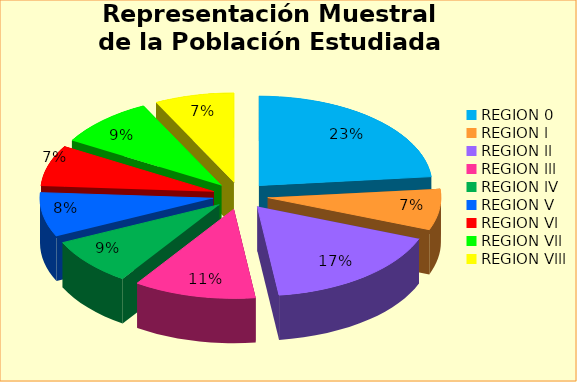
| Category | Series 0 | Series 1 |
|---|---|---|
| REGION 0 | 41 | 0.234 |
| REGION l | 13 | 0.074 |
| REGION ll | 30 | 0.171 |
| REGION lll | 20 | 0.114 |
| REGION lV | 15 | 0.086 |
| REGION V | 14 | 0.08 |
| REGION Vl | 13 | 0.074 |
| REGION Vll | 16 | 0.091 |
| REGION Vlll | 13 | 0.074 |